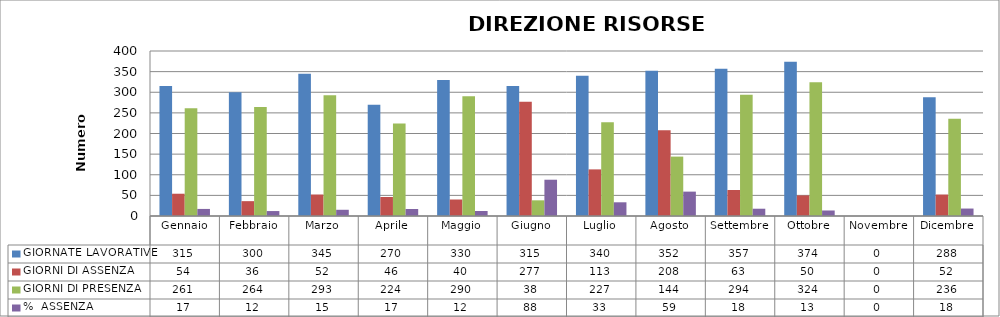
| Category | GIORNATE LAVORATIVE | GIORNI DI ASSENZA | GIORNI DI PRESENZA | %  ASSENZA |
|---|---|---|---|---|
| Gennaio | 315 | 54 | 261 | 17.143 |
| Febbraio | 300 | 36 | 264 | 12 |
| Marzo | 345 | 52 | 293 | 15.072 |
| Aprile | 270 | 46 | 224 | 17.037 |
| Maggio | 330 | 40 | 290 | 12.121 |
| Giugno | 315 | 277 | 38 | 87.937 |
| Luglio | 340 | 113 | 227 | 33.235 |
| Agosto | 352 | 208 | 144 | 59.091 |
| Settembre | 357 | 63 | 294 | 17.647 |
| Ottobre | 374 | 50 | 324 | 13.369 |
| Novembre | 0 | 0 | 0 | 0 |
| Dicembre | 288 | 52 | 236 | 18.056 |